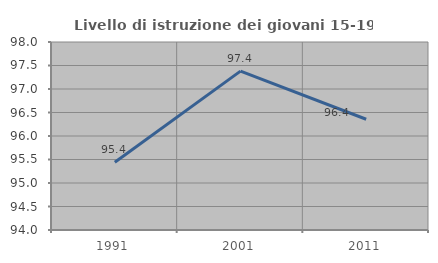
| Category | Livello di istruzione dei giovani 15-19 anni |
|---|---|
| 1991.0 | 95.442 |
| 2001.0 | 97.38 |
| 2011.0 | 96.356 |